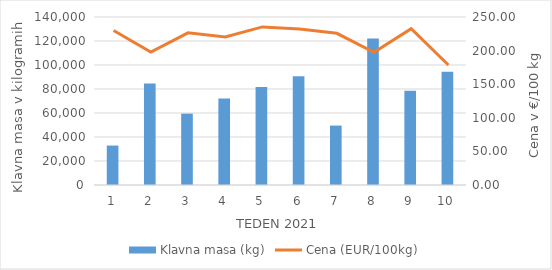
| Category | Klavna masa (kg) |
|---|---|
| 1.0 | 32871 |
| 2.0 | 84639 |
| 3.0 | 59476 |
| 4.0 | 72013 |
| 5.0 | 81759 |
| 6.0 | 90669 |
| 7.0 | 49517 |
| 8.0 | 122111 |
| 9.0 | 78545 |
| 10.0 | 94384 |